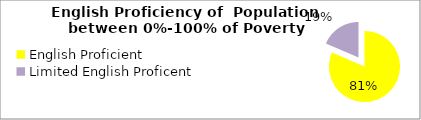
| Category | Percent |
|---|---|
| English Proficient | 0.815 |
| Limited English Proficent | 0.185 |